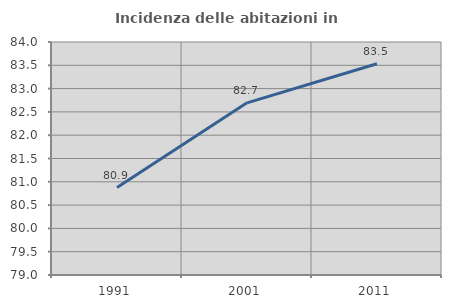
| Category | Incidenza delle abitazioni in proprietà  |
|---|---|
| 1991.0 | 80.876 |
| 2001.0 | 82.694 |
| 2011.0 | 83.534 |